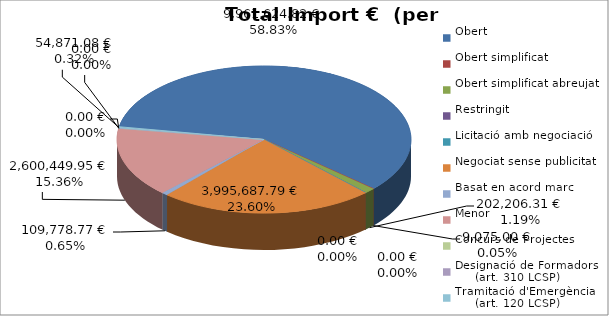
| Category | Total preu
(amb IVA) |
|---|---|
| Obert | 9961624.82 |
| Obert simplificat | 9075 |
| Obert simplificat abreujat | 202206.31 |
| Restringit | 0 |
| Licitació amb negociació | 0 |
| Negociat sense publicitat | 3995687.79 |
| Basat en acord marc | 109778.77 |
| Menor | 2600449.95 |
| Concurs de Projectes | 0 |
| Designació de Formadors
     (art. 310 LCSP) | 0 |
| Tramitació d'Emergència
     (art. 120 LCSP) | 54871.08 |